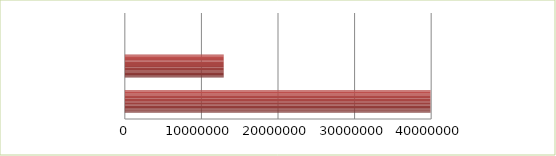
| Category | Series 0 | Series 1 |
|---|---|---|
| 0 | 2.5 | 39908032 |
| 1 | 2.6 | 12909083 |
| 2 | 2.7 | 0 |